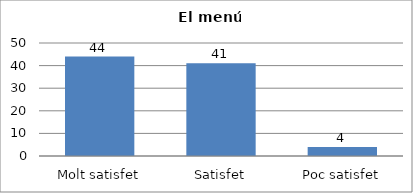
| Category | Series 0 |
|---|---|
| Molt satisfet | 44 |
| Satisfet | 41 |
| Poc satisfet | 4 |